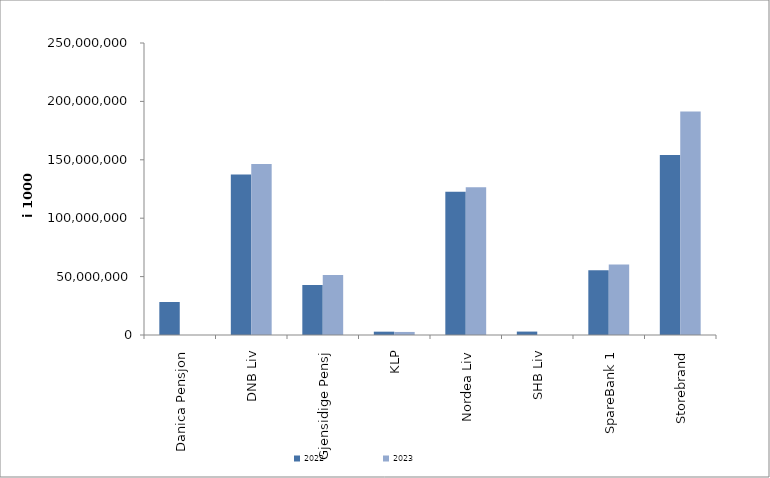
| Category | 2022 | 2023 |
|---|---|---|
| Danica Pensjon | 28240109.531 | 0 |
| DNB Liv | 137360760.34 | 146459867.642 |
| Gjensidige Pensj | 42719338 | 51422836 |
| KLP | 2847329.139 | 2609059.097 |
| Nordea Liv | 122540880 | 126457560 |
| SHB Liv | 2929926.875 | 0 |
| SpareBank 1 | 55349782.673 | 60413574.038 |
| Storebrand | 154175707.567 | 191251233.176 |